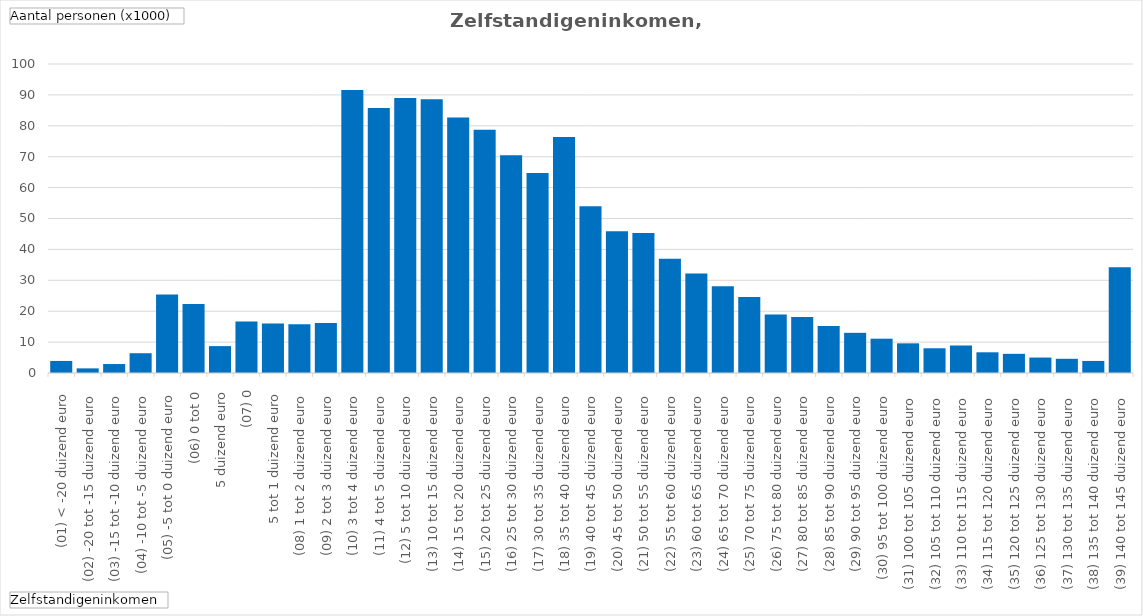
| Category | Totaal |
|---|---|
| (01) < -20 duizend euro | 3.9 |
| (02) -20 tot -15 duizend euro | 1.5 |
| (03) -15 tot -10 duizend euro | 2.9 |
| (04) -10 tot -5 duizend euro | 6.4 |
| (05) -5 tot 0 duizend euro | 25.4 |
| (06) 0 tot 0,5 duizend euro | 22.3 |
| (07) 0,5 tot 1 duizend euro | 8.7 |
| (08) 1 tot 2 duizend euro | 16.7 |
| (09) 2 tot 3 duizend euro | 16 |
| (10) 3 tot 4 duizend euro | 15.8 |
| (11) 4 tot 5 duizend euro | 16.2 |
| (12) 5 tot 10 duizend euro | 91.6 |
| (13) 10 tot 15 duizend euro | 85.8 |
| (14) 15 tot 20 duizend euro | 89 |
| (15) 20 tot 25 duizend euro | 88.6 |
| (16) 25 tot 30 duizend euro | 82.7 |
| (17) 30 tot 35 duizend euro | 78.7 |
| (18) 35 tot 40 duizend euro | 70.5 |
| (19) 40 tot 45 duizend euro | 64.7 |
| (20) 45 tot 50 duizend euro | 76.4 |
| (21) 50 tot 55 duizend euro | 54 |
| (22) 55 tot 60 duizend euro | 45.9 |
| (23) 60 tot 65 duizend euro | 45.3 |
| (24) 65 tot 70 duizend euro | 37 |
| (25) 70 tot 75 duizend euro | 32.2 |
| (26) 75 tot 80 duizend euro | 28.1 |
| (27) 80 tot 85 duizend euro | 24.6 |
| (28) 85 tot 90 duizend euro | 18.9 |
| (29) 90 tot 95 duizend euro | 18.1 |
| (30) 95 tot 100 duizend euro | 15.2 |
| (31) 100 tot 105 duizend euro | 13 |
| (32) 105 tot 110 duizend euro | 11.1 |
| (33) 110 tot 115 duizend euro | 9.6 |
| (34) 115 tot 120 duizend euro | 8 |
| (35) 120 tot 125 duizend euro | 8.9 |
| (36) 125 tot 130 duizend euro | 6.7 |
| (37) 130 tot 135 duizend euro | 6.2 |
| (38) 135 tot 140 duizend euro | 5 |
| (39) 140 tot 145 duizend euro | 4.6 |
| (40) 145 tot 150 duizend euro | 3.9 |
| (41) ≥ 150 duizend euro | 34.2 |